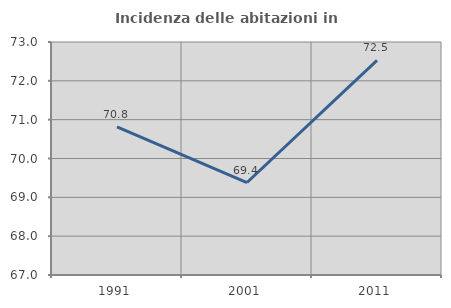
| Category | Incidenza delle abitazioni in proprietà  |
|---|---|
| 1991.0 | 70.815 |
| 2001.0 | 69.381 |
| 2011.0 | 72.527 |